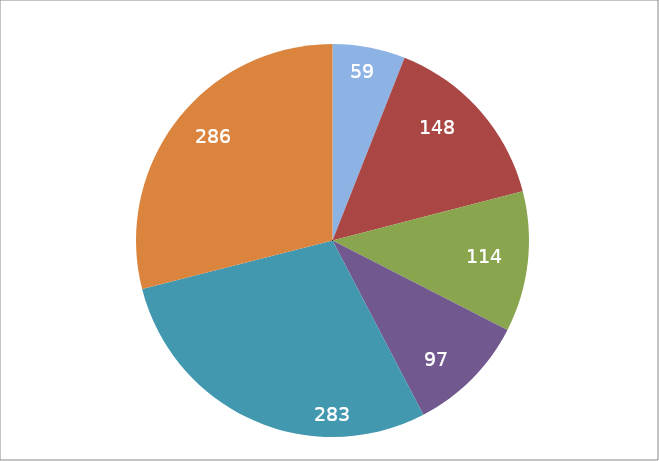
| Category | Series 1 |
|---|---|
| 0 | 59 |
| 1 | 148 |
| 2 | 114 |
| 3 | 97 |
| 4 | 283 |
| 5 | 286 |